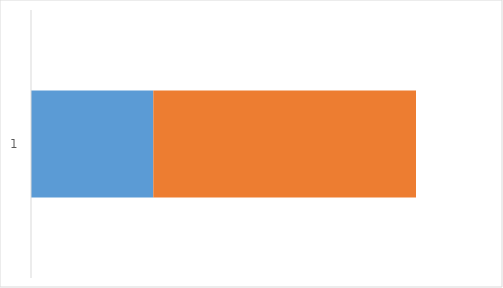
| Category | Так | Ні  |
|---|---|---|
| 0 | 0.318 | 0.682 |